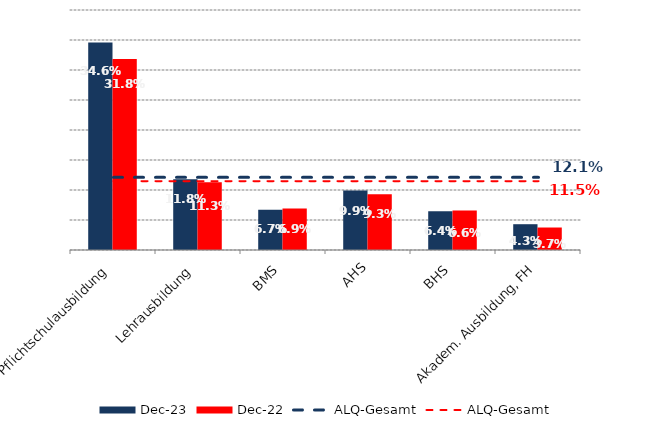
| Category | Dez 23 | Dez 22 |
|---|---|---|
| Pflichtschulausbildung | 0.346 | 0.318 |
| Lehrausbildung | 0.118 | 0.113 |
| BMS | 0.067 | 0.069 |
| AHS | 0.099 | 0.093 |
| BHS | 0.064 | 0.066 |
| Akadem. Ausbildung, FH | 0.043 | 0.037 |